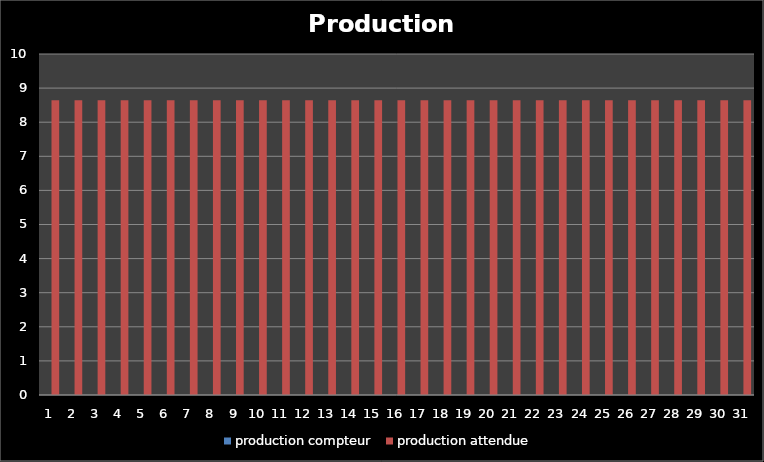
| Category | production compteur | production attendue |
|---|---|---|
| 1.0 | 0 | 8.645 |
| 2.0 | 0 | 8.645 |
| 3.0 | 0 | 8.645 |
| 4.0 | 0 | 8.645 |
| 5.0 | 0 | 8.645 |
| 6.0 | 0 | 8.645 |
| 7.0 | 0 | 8.645 |
| 8.0 | 0 | 8.645 |
| 9.0 | 0 | 8.645 |
| 10.0 | 0 | 8.645 |
| 11.0 | 0 | 8.645 |
| 12.0 | 0 | 8.645 |
| 13.0 | 0 | 8.645 |
| 14.0 | 0 | 8.645 |
| 15.0 | 0 | 8.645 |
| 16.0 | 0 | 8.645 |
| 17.0 | 0 | 8.645 |
| 18.0 | 0 | 8.645 |
| 19.0 | 0 | 8.645 |
| 20.0 | 0 | 8.645 |
| 21.0 | 0 | 8.645 |
| 22.0 | 0 | 8.645 |
| 23.0 | 0 | 8.645 |
| 24.0 | 0 | 8.645 |
| 25.0 | 0 | 8.645 |
| 26.0 | 0 | 8.645 |
| 27.0 | 0 | 8.645 |
| 28.0 | 0 | 8.645 |
| 29.0 | 0 | 8.645 |
| 30.0 | 0 | 8.645 |
| 31.0 | 0 | 8.645 |